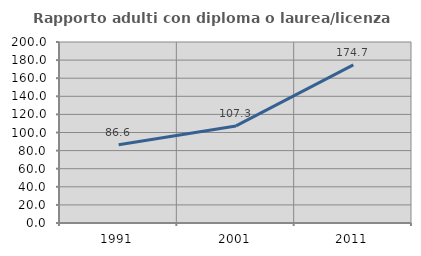
| Category | Rapporto adulti con diploma o laurea/licenza media  |
|---|---|
| 1991.0 | 86.576 |
| 2001.0 | 107.283 |
| 2011.0 | 174.72 |